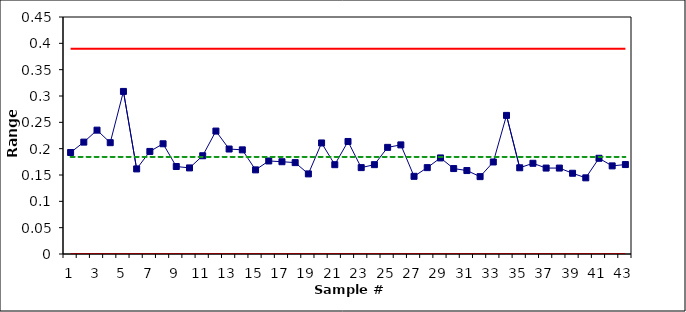
| Category | Range | CL | UCL | LCL |
|---|---|---|---|---|
| 1.0 | 0.193 | 0.184 | 0.39 | 0 |
| 2.0 | 0.212 | 0.184 | 0.39 | 0 |
| 3.0 | 0.235 | 0.184 | 0.39 | 0 |
| 4.0 | 0.211 | 0.184 | 0.39 | 0 |
| 5.0 | 0.309 | 0.184 | 0.39 | 0 |
| 6.0 | 0.162 | 0.184 | 0.39 | 0 |
| 7.0 | 0.195 | 0.184 | 0.39 | 0 |
| 8.0 | 0.209 | 0.184 | 0.39 | 0 |
| 9.0 | 0.166 | 0.184 | 0.39 | 0 |
| 10.0 | 0.163 | 0.184 | 0.39 | 0 |
| 11.0 | 0.187 | 0.184 | 0.39 | 0 |
| 12.0 | 0.233 | 0.184 | 0.39 | 0 |
| 13.0 | 0.199 | 0.184 | 0.39 | 0 |
| 14.0 | 0.198 | 0.184 | 0.39 | 0 |
| 15.0 | 0.16 | 0.184 | 0.39 | 0 |
| 16.0 | 0.177 | 0.184 | 0.39 | 0 |
| 17.0 | 0.175 | 0.184 | 0.39 | 0 |
| 18.0 | 0.174 | 0.184 | 0.39 | 0 |
| 19.0 | 0.152 | 0.184 | 0.39 | 0 |
| 20.0 | 0.211 | 0.184 | 0.39 | 0 |
| 21.0 | 0.17 | 0.184 | 0.39 | 0 |
| 22.0 | 0.214 | 0.184 | 0.39 | 0 |
| 23.0 | 0.164 | 0.184 | 0.39 | 0 |
| 24.0 | 0.17 | 0.184 | 0.39 | 0 |
| 25.0 | 0.202 | 0.184 | 0.39 | 0 |
| 26.0 | 0.207 | 0.184 | 0.39 | 0 |
| 27.0 | 0.147 | 0.184 | 0.39 | 0 |
| 28.0 | 0.164 | 0.184 | 0.39 | 0 |
| 29.0 | 0.182 | 0.184 | 0.39 | 0 |
| 30.0 | 0.162 | 0.184 | 0.39 | 0 |
| 31.0 | 0.158 | 0.184 | 0.39 | 0 |
| 32.0 | 0.147 | 0.184 | 0.39 | 0 |
| 33.0 | 0.175 | 0.184 | 0.39 | 0 |
| 34.0 | 0.263 | 0.184 | 0.39 | 0 |
| 35.0 | 0.164 | 0.184 | 0.39 | 0 |
| 36.0 | 0.172 | 0.184 | 0.39 | 0 |
| 37.0 | 0.163 | 0.184 | 0.39 | 0 |
| 38.0 | 0.163 | 0.184 | 0.39 | 0 |
| 39.0 | 0.153 | 0.184 | 0.39 | 0 |
| 40.0 | 0.145 | 0.184 | 0.39 | 0 |
| 41.0 | 0.182 | 0.184 | 0.39 | 0 |
| 42.0 | 0.167 | 0.184 | 0.39 | 0 |
| 43.0 | 0.17 | 0.184 | 0.39 | 0 |